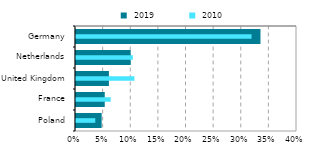
| Category |  2019 |
|---|---|
| Poland | 0.046 |
| France | 0.052 |
| United Kingdom | 0.06 |
| Netherlands | 0.099 |
| Germany | 0.334 |